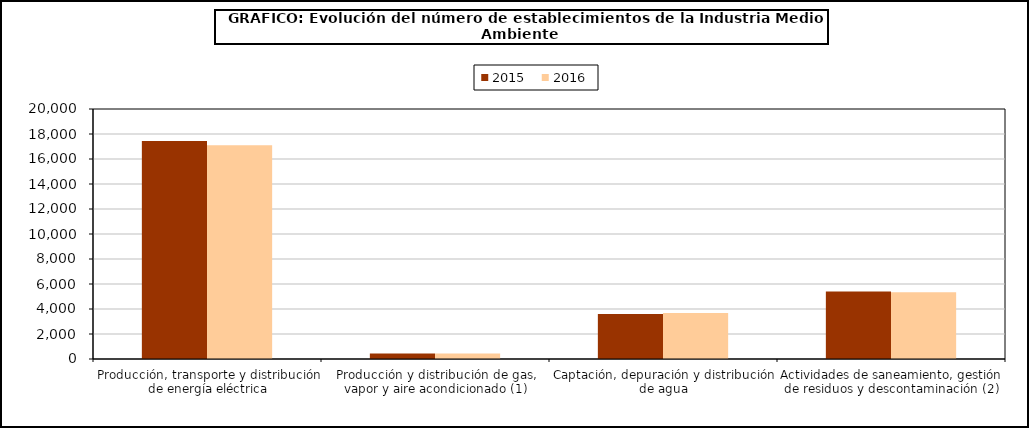
| Category | 2015 | 2016 |
|---|---|---|
| Producción, transporte y distribución de energía eléctrica | 17447 | 17096 |
| Producción y distribución de gas, vapor y aire acondicionado (1) | 436 | 436 |
| Captación, depuración y distribución de agua | 3602 | 3687 |
| Actividades de saneamiento, gestión de residuos y descontaminación (2) | 5397 | 5349 |